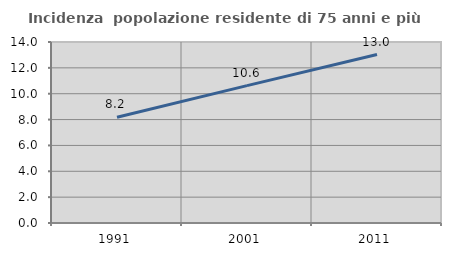
| Category | Incidenza  popolazione residente di 75 anni e più |
|---|---|
| 1991.0 | 8.178 |
| 2001.0 | 10.627 |
| 2011.0 | 13.031 |